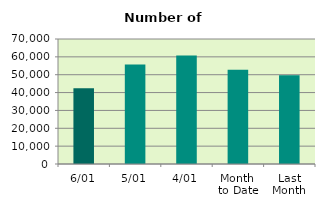
| Category | Series 0 |
|---|---|
| 6/01 | 42472 |
| 5/01 | 55742 |
| 4/01 | 60696 |
| Month 
to Date | 52729.5 |
| Last
Month | 49764 |